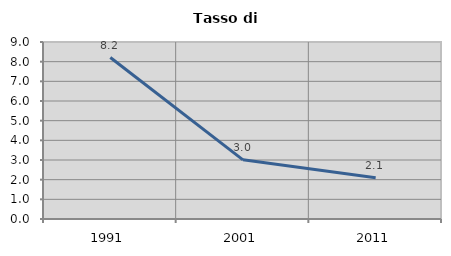
| Category | Tasso di disoccupazione   |
|---|---|
| 1991.0 | 8.212 |
| 2001.0 | 3.009 |
| 2011.0 | 2.096 |